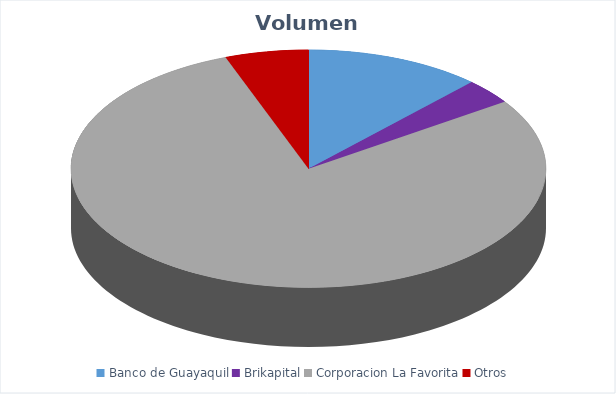
| Category | VOLUMEN ($USD) |
|---|---|
| Banco de Guayaquil | 7000 |
| Brikapital | 2000 |
| Corporacion La Favorita | 45930.14 |
| Otros | 3300 |